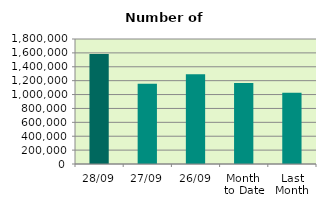
| Category | Series 0 |
|---|---|
| 28/09 | 1583124 |
| 27/09 | 1154560 |
| 26/09 | 1290800 |
| Month 
to Date | 1165775.6 |
| Last
Month | 1026775.304 |